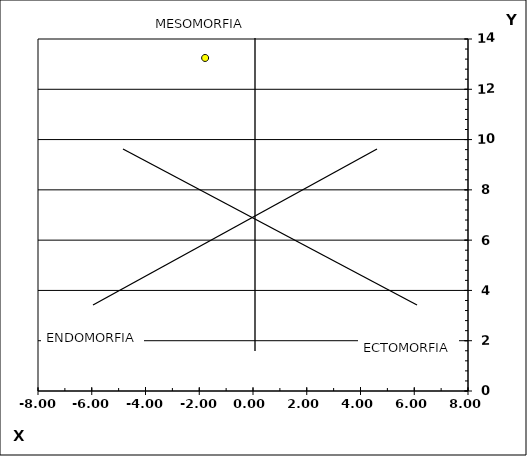
| Category | Series 1 |
|---|---|
| -1.7813622826122635 | 13.246 |